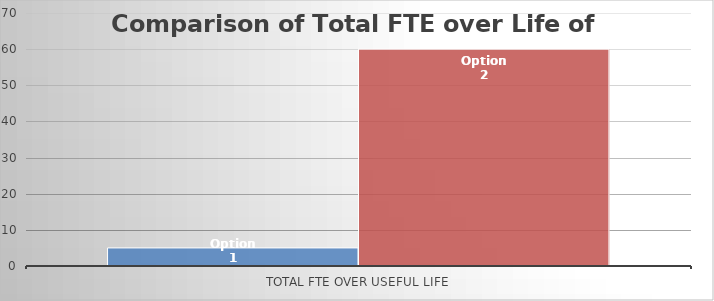
| Category | Option 1 | Option 2 |
|---|---|---|
| Total FTE over useful life | 5 | 60 |